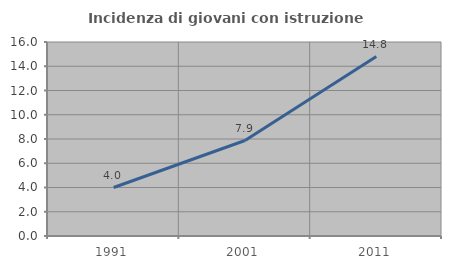
| Category | Incidenza di giovani con istruzione universitaria |
|---|---|
| 1991.0 | 4 |
| 2001.0 | 7.874 |
| 2011.0 | 14.796 |